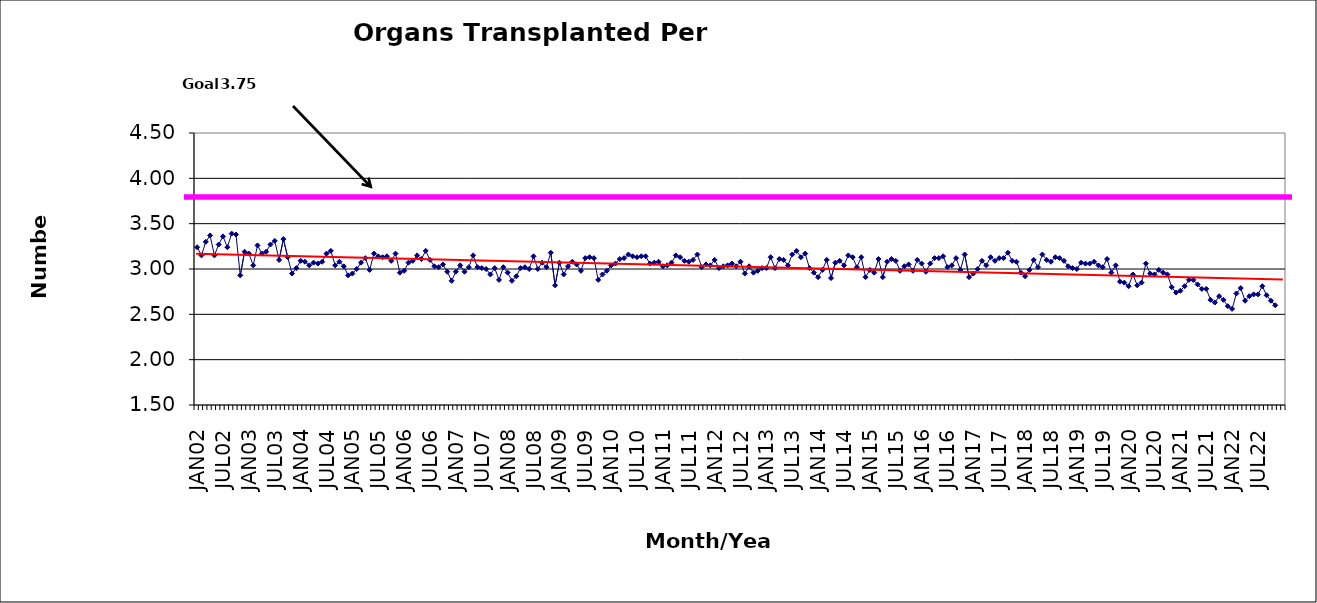
| Category | Series 0 |
|---|---|
| JAN02 | 3.24 |
| FEB02 | 3.15 |
| MAR02 | 3.3 |
| APR02 | 3.37 |
| MAY02 | 3.15 |
| JUN02 | 3.27 |
| JUL02 | 3.36 |
| AUG02 | 3.24 |
| SEP02 | 3.39 |
| OCT02 | 3.38 |
| NOV02 | 2.93 |
| DEC02 | 3.19 |
| JAN03 | 3.17 |
| FEB03 | 3.04 |
| MAR03 | 3.26 |
| APR03 | 3.17 |
| MAY03 | 3.19 |
| JUN03 | 3.27 |
| JUL03 | 3.31 |
| AUG03 | 3.1 |
| SEP03 | 3.33 |
| OCT03 | 3.13 |
| NOV03 | 2.95 |
| DEC03 | 3.01 |
| JAN04 | 3.09 |
| FEB04 | 3.08 |
| MAR04 | 3.04 |
| APR04 | 3.07 |
| MAY04 | 3.06 |
| JUN04 | 3.08 |
| JUL04 | 3.17 |
| AUG04 | 3.2 |
| SEP04 | 3.04 |
| OCT04 | 3.08 |
| NOV04 | 3.03 |
| DEC04 | 2.93 |
| JAN05 | 2.95 |
| FEB05 | 3 |
| MAR05 | 3.07 |
| APR05 | 3.12 |
| MAY05 | 2.99 |
| JUN05 | 3.17 |
| JUL05 | 3.14 |
| AUG05 | 3.13 |
| SEP05 | 3.14 |
| OCT05 | 3.09 |
| NOV05 | 3.17 |
| DEC05 | 2.96 |
| JAN06 | 2.98 |
| FEB06 | 3.07 |
| MAR06 | 3.09 |
| APR06 | 3.15 |
| MAY06 | 3.11 |
| JUN06 | 3.2 |
| JUL06 | 3.1 |
| AUG06 | 3.03 |
| SEP06 | 3.02 |
| OCT06 | 3.05 |
| NOV06 | 2.97 |
| DEC06 | 2.87 |
| JAN07 | 2.97 |
| FEB07 | 3.04 |
| MAR07 | 2.97 |
| APR07 | 3.02 |
| MAY07 | 3.15 |
| JUN07 | 3.02 |
| JUL07 | 3.01 |
| AUG07 | 3 |
| SEP07 | 2.94 |
| OCT07 | 3.01 |
| NOV07 | 2.88 |
| DEC07 | 3.02 |
| JAN08 | 2.96 |
| FEB08 | 2.87 |
| MAR08 | 2.92 |
| APR08 | 3.01 |
| MAY08 | 3.02 |
| JUN08 | 3 |
| JUL08 | 3.14 |
| AUG08 | 3 |
| SEP08 | 3.07 |
| OCT08 | 3.02 |
| NOV08 | 3.18 |
| DEC08 | 2.82 |
| JAN09 | 3.07 |
| FEB09 | 2.94 |
| MAR09 | 3.03 |
| APR09 | 3.08 |
| MAY09 | 3.05 |
| JUN09 | 2.98 |
| JUL09 | 3.12 |
| AUG09 | 3.13 |
| SEP09 | 3.12 |
| OCT09 | 2.88 |
| NOV09 | 2.94 |
| DEC09 | 2.98 |
| JAN10 | 3.04 |
| FEB10 | 3.06 |
| MAR10 | 3.11 |
| APR10 | 3.12 |
| MAY10 | 3.16 |
| JUN10 | 3.14 |
| JUL10 | 3.13 |
| AUG10 | 3.14 |
| SEP10 | 3.14 |
| OCT10 | 3.06 |
| NOV10 | 3.07 |
| DEC10 | 3.08 |
| JAN11 | 3.03 |
| FEB11 | 3.04 |
| MAR11 | 3.07 |
| APR11 | 3.15 |
| MAY11 | 3.13 |
| JUN11 | 3.09 |
| JUL11 | 3.08 |
| AUG11 | 3.1 |
| SEP11 | 3.16 |
| OCT11 | 3.02 |
| NOV11 | 3.05 |
| DEC11 | 3.04 |
| JAN12 | 3.1 |
| FEB12 | 3.01 |
| MAR12 | 3.03 |
| APR12 | 3.04 |
| MAY12 | 3.06 |
| JUN12 | 3.03 |
| JUL12 | 3.08 |
| AUG12 | 2.95 |
| SEP12 | 3.03 |
| OCT12 | 2.96 |
| NOV12 | 2.98 |
| DEC12 | 3.01 |
| JAN13 | 3.01 |
| FEB13 | 3.13 |
| MAR13 | 3.01 |
| APR13 | 3.11 |
| MAY13 | 3.1 |
| JUN13 | 3.04 |
| JUL13 | 3.16 |
| AUG13 | 3.2 |
| SEP13 | 3.13 |
| OCT13 | 3.17 |
| NOV13 | 3.01 |
| DEC13 | 2.96 |
| JAN14 | 2.91 |
| FEB14 | 2.99 |
| MAR14 | 3.1 |
| APR14 | 2.9 |
| MAY14 | 3.07 |
| JUN14 | 3.09 |
| JUL14 | 3.04 |
| AUG14 | 3.15 |
| SEP14 | 3.13 |
| OCT14 | 3.02 |
| NOV14 | 3.13 |
| DEC14 | 2.91 |
| JAN15 | 2.99 |
| FEB15 | 2.96 |
| MAR15 | 3.11 |
| APR15 | 2.91 |
| MAY15 | 3.08 |
| JUN15 | 3.11 |
| JUL15 | 3.09 |
| AUG15 | 2.98 |
| SEP15 | 3.03 |
| OCT15 | 3.05 |
| NOV15 | 2.98 |
| DEC15 | 3.1 |
| JAN16 | 3.06 |
| FEB16 | 2.97 |
| MAR16 | 3.06 |
| APR16 | 3.12 |
| MAY16 | 3.12 |
| JUN16 | 3.14 |
| JUL16 | 3.02 |
| AUG16 | 3.04 |
| SEP16 | 3.12 |
| OCT16 | 2.99 |
| NOV16 | 3.16 |
| DEC16 | 2.91 |
| JAN17 | 2.95 |
| FEB17 | 3 |
| MAR17 | 3.09 |
| APR17 | 3.04 |
| MAY17 | 3.13 |
| JUN17 | 3.09 |
| JUL17 | 3.12 |
| AUG17 | 3.12 |
| SEP17 | 3.18 |
| OCT17 | 3.09 |
| NOV17 | 3.08 |
| DEC17 | 2.96 |
| JAN18 | 2.92 |
| FEB18 | 2.99 |
| MAR18 | 3.1 |
| APR18 | 3.02 |
| MAY18 | 3.16 |
| JUN18 | 3.1 |
| JUL18 | 3.08 |
| AUG18 | 3.13 |
| SEP18 | 3.12 |
| OCT18 | 3.09 |
| NOV18 | 3.03 |
| DEC18 | 3.01 |
| JAN19 | 3 |
| FEB19 | 3.07 |
| MAR19 | 3.06 |
| APR19 | 3.06 |
| MAY19 | 3.08 |
| JUN19 | 3.04 |
| JUL19 | 3.02 |
| AUG19 | 3.11 |
| SEP19 | 2.96 |
| OCT19 | 3.04 |
| NOV19 | 2.86 |
| DEC19 | 2.85 |
| JAN20 | 2.81 |
| FEB20 | 2.94 |
| MAR20 | 2.82 |
| APR20 | 2.85 |
| MAY20 | 3.06 |
| JUN20 | 2.95 |
| JUL20 | 2.94 |
| AUG20 | 2.99 |
| SEP20 | 2.96 |
| OCT20 | 2.94 |
| NOV20 | 2.8 |
| DEC20 | 2.74 |
| JAN21 | 2.76 |
| FEB21 | 2.81 |
| MAR21 | 2.88 |
| APR21 | 2.88 |
| MAY21 | 2.83 |
| JUN21 | 2.78 |
| JUL21 | 2.78 |
| AUG21 | 2.66 |
| SEP21 | 2.63 |
| OCT21 | 2.7 |
| NOV21 | 2.66 |
| DEC21 | 2.59 |
| JAN22 | 2.56 |
| FEB22 | 2.73 |
| MAR22 | 2.79 |
| APR22 | 2.65 |
| MAY22 | 2.7 |
| JUN22 | 2.72 |
| JUL22 | 2.72 |
| AUG22 | 2.81 |
| SEP22 | 2.71 |
| OCT22 | 2.65 |
| NOV22 | 2.6 |